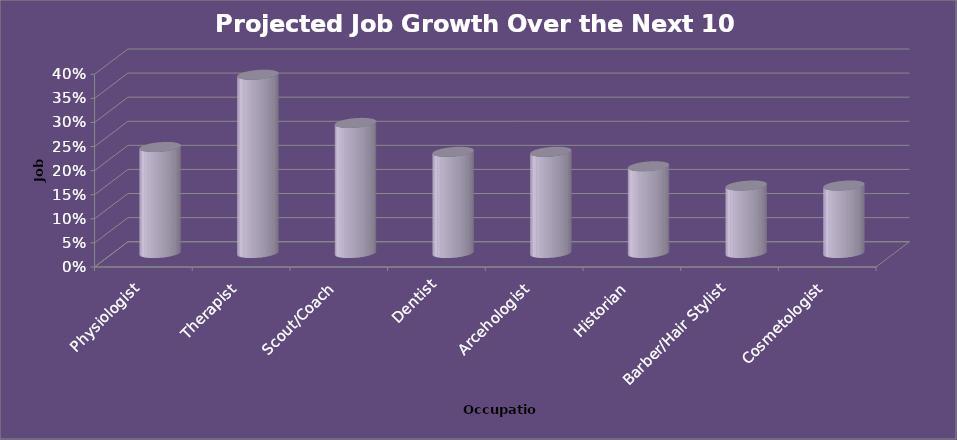
| Category | Projected Job Growth over the next 10 years Percentage Growth |
|---|---|
| Physiologist | 0.22 |
| Therapist | 0.37 |
| Scout/Coach | 0.27 |
| Dentist | 0.21 |
| Arcehologist | 0.21 |
| Historian | 0.18 |
| Barber/Hair Stylist | 0.14 |
| Cosmetologist | 0.14 |